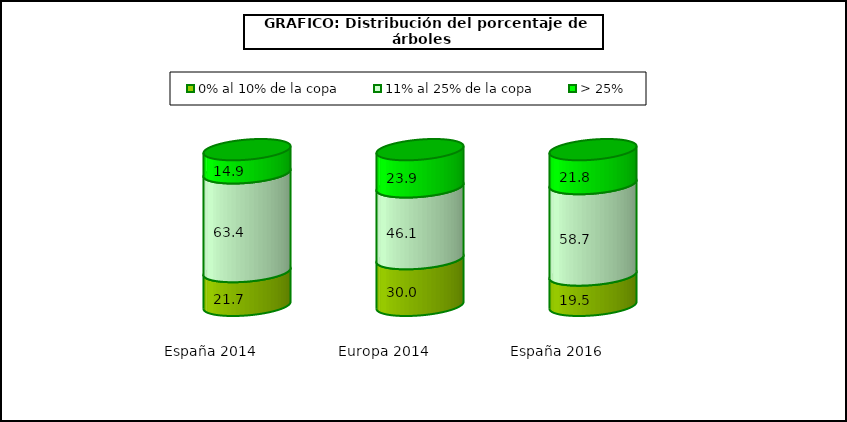
| Category | 0% al 10% de la copa | 11% al 25% de la copa | > 25% |
|---|---|---|---|
| España 2014 | 21.7 | 63.4 | 14.9 |
| Europa 2014 | 30 | 46.1 | 23.9 |
| España 2016 | 19.5 | 58.7 | 21.8 |